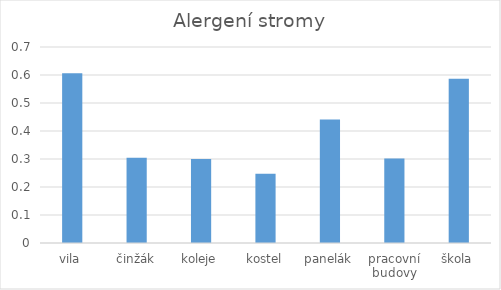
| Category | Series 0 |
|---|---|
| vila | 0.606 |
| činžák | 0.304 |
| koleje | 0.3 |
| kostel | 0.248 |
| panelák | 0.442 |
| pracovní budovy | 0.302 |
| škola | 0.587 |